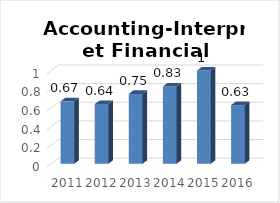
| Category | Series 0 |
|---|---|
| 2011.0 | 0.67 |
| 2012.0 | 0.64 |
| 2013.0 | 0.75 |
| 2014.0 | 0.83 |
| 2015.0 | 1 |
| 2016.0 | 0.63 |